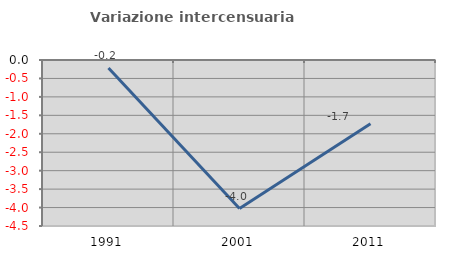
| Category | Variazione intercensuaria annua |
|---|---|
| 1991.0 | -0.219 |
| 2001.0 | -4.026 |
| 2011.0 | -1.725 |